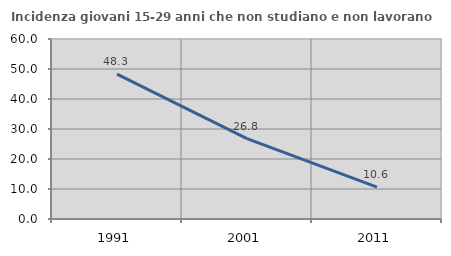
| Category | Incidenza giovani 15-29 anni che non studiano e non lavorano  |
|---|---|
| 1991.0 | 48.276 |
| 2001.0 | 26.786 |
| 2011.0 | 10.638 |